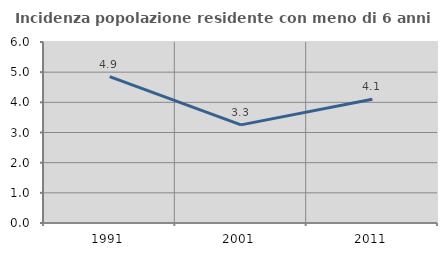
| Category | Incidenza popolazione residente con meno di 6 anni |
|---|---|
| 1991.0 | 4.854 |
| 2001.0 | 3.254 |
| 2011.0 | 4.105 |